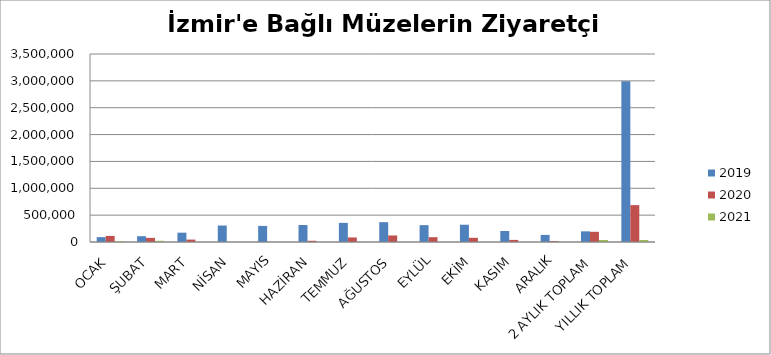
| Category | 2019 | 2020 | 2021 |
|---|---|---|---|
| OCAK | 90406 | 113675 | 14992 |
| ŞUBAT | 108321 | 76403 | 21877 |
| MART | 173542 | 44613 | 0 |
| NİSAN | 306745 | 0 | 0 |
| MAYIS | 299441 | 0 | 0 |
| HAZİRAN | 316361 | 22885 | 0 |
| TEMMUZ | 356504 | 84548 | 0 |
| AĞUSTOS | 369370 | 121753 | 0 |
| EYLÜL | 313284 | 89757 | 0 |
| EKİM | 321498 | 78061 | 0 |
| KASIM | 205258 | 39134 | 0 |
| ARALIK | 131881 | 16010 | 0 |
| 2 AYLIK TOPLAM | 198727 | 190078 | 36869 |
| YILLIK TOPLAM | 2992611 | 686839 | 36869 |